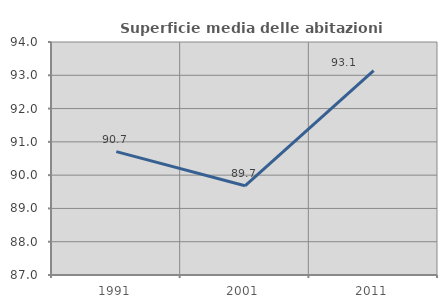
| Category | Superficie media delle abitazioni occupate |
|---|---|
| 1991.0 | 90.706 |
| 2001.0 | 89.679 |
| 2011.0 | 93.143 |